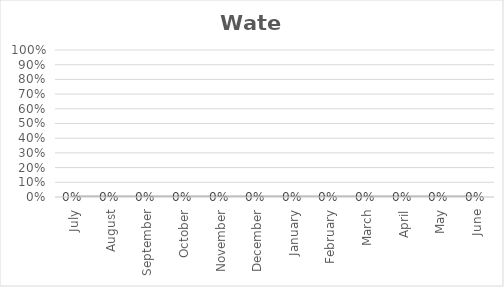
| Category | Water |
|---|---|
| July | 0 |
| August | 0 |
| September | 0 |
| October | 0 |
| November | 0 |
| December | 0 |
| January | 0 |
| February | 0 |
| March | 0 |
| April | 0 |
| May | 0 |
| June | 0 |